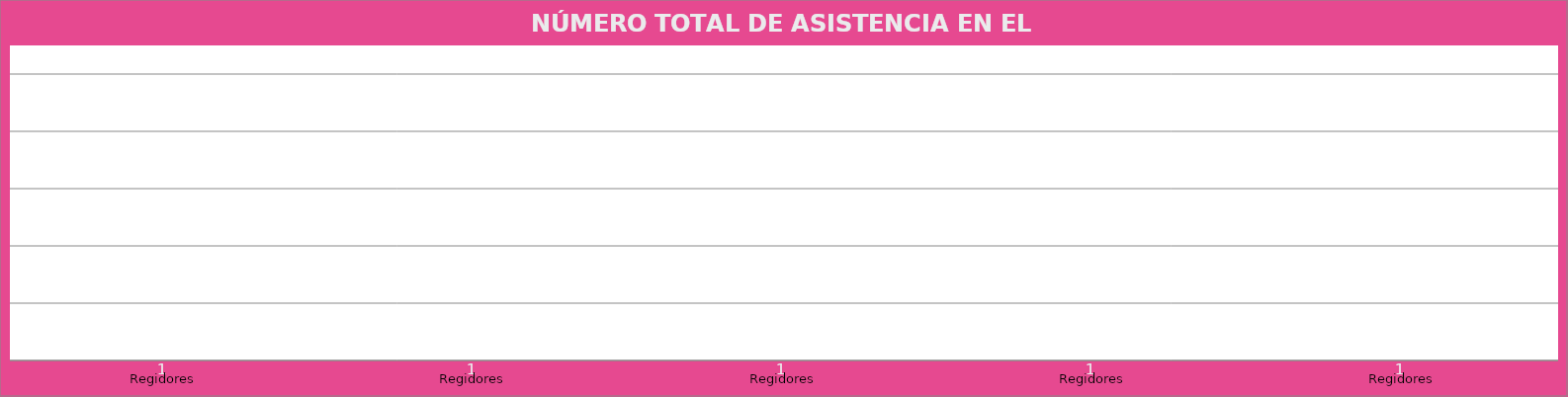
| Category | Regidores |
|---|---|
| Regidores | 1 |
| Regidores | 1 |
| Regidores | 1 |
| Regidores | 1 |
| Regidores | 1 |